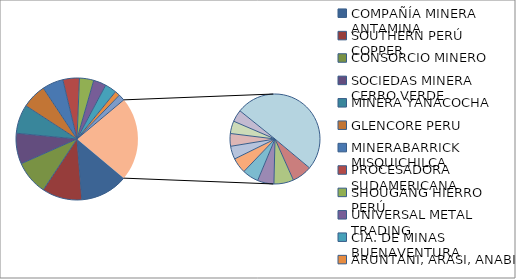
| Category | Series 0 |
|---|---|
| COMPAÑÍA MINERA ANTAMINA | 3384338 |
| SOUTHERN PERÚ COPPER | 2829021 |
| CONSORCIO MINERO | 2418716 |
| SOCIEDAS MINERA CERRO VERDE | 2181883 |
| MINERA YANACOCHA | 2049535 |
| GLENCORE PERU | 1744538 |
| MINERABARRICK MISQUICHILCA | 1487193 |
| PROCESADORA SUDAMERICANA | 1171696 |
| SHOUGANG HIERRO PERÚ | 1011816 |
| UNIVERSAL METAL TRADING | 901181 |
| CÍA. DE MINAS BUENAVENTURA | 825916 |
| ARUNTANI, ARASI, ANABI | 362020 |
| SOCIEDAD MINERA RINCONADA | 448068 |
| GOLD FIELDS LA CIMA | 427424 |
| XSTRATA TINTAYA | 420203 |
| LOUIS DREYFUS PERÚ | 351400 |
| MINERA SUYAMARCA | 347062 |
| NUNERALES DEL SUR | 328548 |
| COMERCIALIZADORA TAMBO REAL | 279697 |
| CIA. MIN. AURIFERA SANTA ROSA | 270041 |
| VOTORANTIM METAIS | 267836 |
| MINERA AURÍFERA RETAMAS | 256055 |
| Empresas 25 +++ | 2984080 |